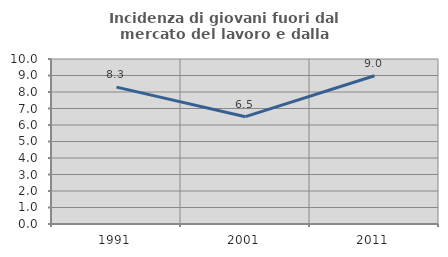
| Category | Incidenza di giovani fuori dal mercato del lavoro e dalla formazione  |
|---|---|
| 1991.0 | 8.296 |
| 2001.0 | 6.504 |
| 2011.0 | 8.986 |